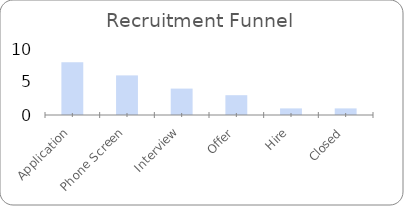
| Category | Series 0 |
|---|---|
| Application | 8 |
| Phone Screen | 6 |
| Interview | 4 |
| Offer | 3 |
| Hire | 1 |
| Closed | 1 |